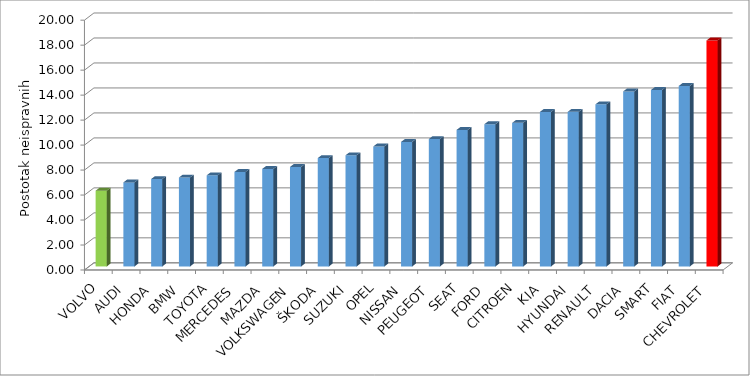
| Category | Series 4 |
|---|---|
| VOLVO | 6.067 |
| AUDI | 6.729 |
| HONDA | 6.997 |
| BMW | 7.12 |
| TOYOTA | 7.293 |
| MERCEDES | 7.565 |
| MAZDA | 7.808 |
| VOLKSWAGEN | 7.966 |
| ŠKODA | 8.675 |
| SUZUKI | 8.901 |
| OPEL | 9.606 |
| NISSAN | 9.97 |
| PEUGEOT | 10.202 |
| SEAT | 10.931 |
| FORD | 11.39 |
| CITROEN | 11.495 |
| KIA | 12.369 |
| HYUNDAI | 12.377 |
| RENAULT | 12.979 |
| DACIA | 14.013 |
| SMART | 14.127 |
| FIAT | 14.45 |
| CHEVROLET | 18.092 |